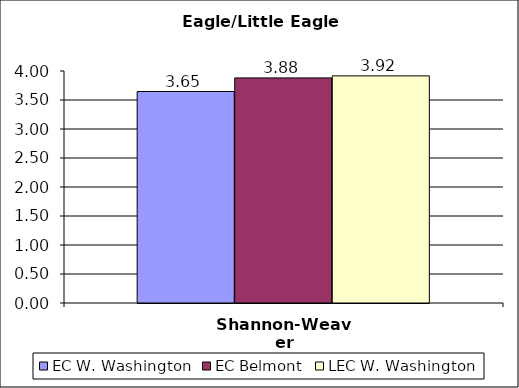
| Category | EC W. Washington | EC Belmont | LEC W. Washington |
|---|---|---|---|
| Shannon-Weaver | 3.646 | 3.881 | 3.916 |